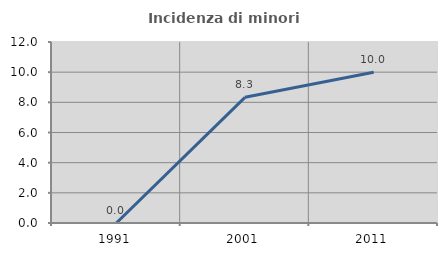
| Category | Incidenza di minori stranieri |
|---|---|
| 1991.0 | 0 |
| 2001.0 | 8.333 |
| 2011.0 | 10 |